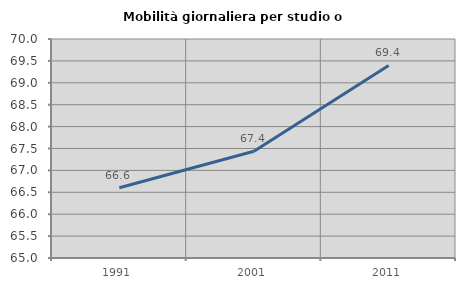
| Category | Mobilità giornaliera per studio o lavoro |
|---|---|
| 1991.0 | 66.603 |
| 2001.0 | 67.437 |
| 2011.0 | 69.397 |